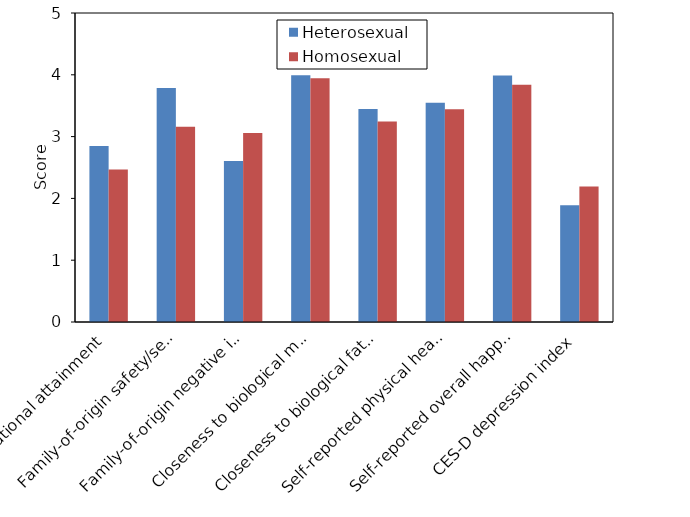
| Category | Heterosexual | Homosexual |
|---|---|---|
| Educational attainment | 2.846 | 2.467 |
| Family-of-origin safety/security | 3.788 | 3.16 |
| Family-of-origin negative impact | 2.606 | 3.059 |
| Closeness to biological mother | 3.995 | 3.945 |
| Closeness to biological father | 3.447 | 3.244 |
| Self-reported physical health | 3.547 | 3.442 |
| Self-reported overall happiness | 3.987 | 3.837 |
| CES-D depression index | 1.887 | 2.194 |